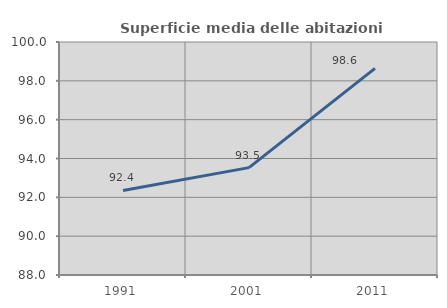
| Category | Superficie media delle abitazioni occupate |
|---|---|
| 1991.0 | 92.352 |
| 2001.0 | 93.531 |
| 2011.0 | 98.644 |